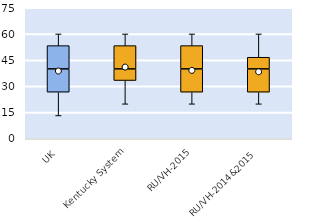
| Category | 25th | 50th | 75th |
|---|---|---|---|
| UK | 26.667 | 13.333 | 13.333 |
| Kentucky System | 33.333 | 6.667 | 13.333 |
| RU/VH-2015 | 26.667 | 13.333 | 13.333 |
| RU/VH-2014&2015 | 26.667 | 13.333 | 6.667 |